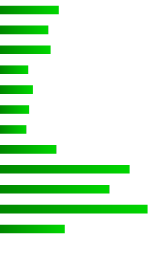
| Category | Series 0 |
|---|---|
| 0 | 0.075 |
| 1 | 0.061 |
| 2 | 0.064 |
| 3 | 0.035 |
| 4 | 0.041 |
| 5 | 0.037 |
| 6 | 0.033 |
| 7 | 0.072 |
| 8 | 0.167 |
| 9 | 0.141 |
| 10 | 0.19 |
| 11 | 0.083 |